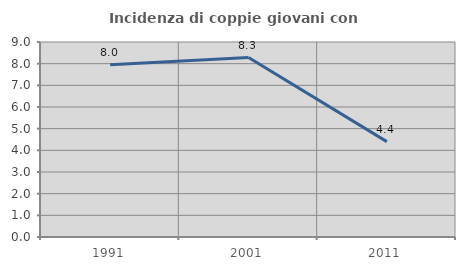
| Category | Incidenza di coppie giovani con figli |
|---|---|
| 1991.0 | 7.955 |
| 2001.0 | 8.284 |
| 2011.0 | 4.403 |